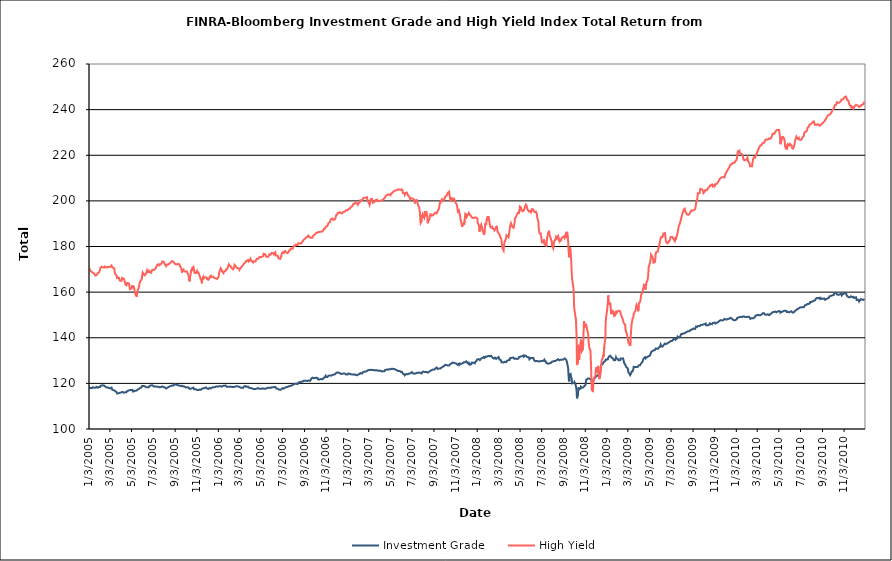
| Category | Investment Grade | High Yield |
|---|---|---|
| 1/3/05 | 118.355 | 170.574 |
| 1/4/05 | 118.169 | 170.517 |
| 1/5/05 | 117.956 | 169.694 |
| 1/6/05 | 117.989 | 169.699 |
| 1/7/05 | 117.939 | 169.542 |
| 1/10/05 | 117.87 | 168.823 |
| 1/11/05 | 117.994 | 168.603 |
| 1/12/05 | 118.07 | 168.683 |
| 1/13/05 | 118.318 | 168.609 |
| 1/14/05 | 118.212 | 168.194 |
| 1/18/05 | 118.078 | 168.042 |
| 1/19/05 | 118.176 | 168.174 |
| 1/20/05 | 118.084 | 167.284 |
| 1/21/05 | 118.194 | 167.368 |
| 1/24/05 | 118.473 | 167.478 |
| 1/25/05 | 118.13 | 167.697 |
| 1/26/05 | 118.18 | 167.906 |
| 1/27/05 | 118.08 | 168.274 |
| 1/28/05 | 118.339 | 168.482 |
| 1/31/05 | 118.456 | 168.678 |
| 2/1/05 | 118.49 | 169.105 |
| 2/2/05 | 118.486 | 169.572 |
| 2/3/05 | 118.433 | 169.887 |
| 2/4/05 | 118.911 | 170.571 |
| 2/7/05 | 119.08 | 171.144 |
| 2/8/05 | 119.178 | 171.413 |
| 2/9/05 | 119.306 | 171.25 |
| 2/10/05 | 119.155 | 170.924 |
| 2/11/05 | 118.971 | 170.593 |
| 2/14/05 | 119.042 | 170.773 |
| 2/15/05 | 118.98 | 171.171 |
| 2/16/05 | 118.766 | 171.224 |
| 2/17/05 | 118.661 | 171.303 |
| 2/18/05 | 118.352 | 171.032 |
| 2/22/05 | 118.139 | 170.748 |
| 2/23/05 | 118.254 | 170.912 |
| 2/24/05 | 118.225 | 171.081 |
| 2/25/05 | 118.18 | 171.134 |
| 2/28/05 | 117.922 | 170.988 |
| 3/1/05 | 117.796 | 170.877 |
| 3/2/05 | 117.736 | 170.785 |
| 3/3/05 | 117.802 | 171.032 |
| 3/4/05 | 117.918 | 171.289 |
| 3/7/05 | 118.124 | 171.696 |
| 3/8/05 | 117.817 | 171.944 |
| 3/9/05 | 117.285 | 171.287 |
| 3/10/05 | 117.163 | 170.761 |
| 3/11/05 | 117.065 | 170.715 |
| 3/14/05 | 116.92 | 170.526 |
| 3/15/05 | 116.95 | 170.082 |
| 3/16/05 | 116.622 | 168.726 |
| 3/17/05 | 116.667 | 168.15 |
| 3/18/05 | 116.519 | 168.382 |
| 3/21/05 | 116.211 | 167.214 |
| 3/22/05 | 116.044 | 166.725 |
| 3/23/05 | 115.529 | 165.829 |
| 3/24/05 | 115.888 | 166.493 |
| 3/28/05 | 115.718 | 166.298 |
| 3/29/05 | 115.692 | 165.868 |
| 3/30/05 | 115.75 | 165.095 |
| 3/31/05 | 115.919 | 165.008 |
| 4/1/05 | 116.011 | 165.062 |
| 4/4/05 | 116.057 | 164.966 |
| 4/5/05 | 116.091 | 165.623 |
| 4/6/05 | 116.258 | 166.252 |
| 4/7/05 | 116.289 | 166.516 |
| 4/8/05 | 116.026 | 166.31 |
| 4/11/05 | 115.879 | 165.799 |
| 4/12/05 | 116.017 | 165.62 |
| 4/13/05 | 116.21 | 165.447 |
| 4/14/05 | 116.07 | 164.271 |
| 4/15/05 | 115.942 | 163.43 |
| 4/18/05 | 116.11 | 163.014 |
| 4/19/05 | 116.407 | 163.615 |
| 4/20/05 | 116.606 | 164.067 |
| 4/21/05 | 116.75 | 164.422 |
| 4/22/05 | 116.888 | 164.239 |
| 4/25/05 | 116.912 | 163.83 |
| 4/26/05 | 116.795 | 163.217 |
| 4/27/05 | 116.928 | 162.147 |
| 4/28/05 | 117.106 | 161.274 |
| 4/29/05 | 117.107 | 161.118 |
| 5/2/05 | 117.066 | 161.625 |
| 5/3/05 | 117.088 | 161.922 |
| 5/4/05 | 117.197 | 162.426 |
| 5/5/05 | 117.166 | 163.052 |
| 5/6/05 | 116.464 | 162.072 |
| 5/9/05 | 116.491 | 162.251 |
| 5/10/05 | 116.669 | 161.573 |
| 5/11/05 | 116.738 | 160.583 |
| 5/12/05 | 116.734 | 160.013 |
| 5/13/05 | 116.762 | 159.112 |
| 5/16/05 | 116.825 | 158.382 |
| 5/17/05 | 116.81 | 157.926 |
| 5/18/05 | 117.103 | 159.04 |
| 5/19/05 | 117.2 | 160.332 |
| 5/20/05 | 117.224 | 160.908 |
| 5/23/05 | 117.555 | 161.967 |
| 5/24/05 | 117.615 | 162.394 |
| 5/25/05 | 117.772 | 163.685 |
| 5/26/05 | 117.869 | 164.476 |
| 5/27/05 | 118.04 | 164.878 |
| 5/31/05 | 118.344 | 165.605 |
| 6/1/05 | 118.835 | 166.301 |
| 6/2/05 | 119.15 | 167.915 |
| 6/3/05 | 119.094 | 168.585 |
| 6/6/05 | 118.834 | 167.647 |
| 6/7/05 | 119.123 | 167.992 |
| 6/8/05 | 119.007 | 167.752 |
| 6/9/05 | 118.713 | 167.355 |
| 6/10/05 | 118.558 | 167.947 |
| 6/13/05 | 118.338 | 168.225 |
| 6/14/05 | 118.273 | 168.859 |
| 6/15/05 | 118.235 | 169.375 |
| 6/16/05 | 118.28 | 168.817 |
| 6/17/05 | 118.412 | 168.92 |
| 6/20/05 | 118.306 | 168.848 |
| 6/21/05 | 118.516 | 169.328 |
| 6/22/05 | 118.862 | 169.462 |
| 6/23/05 | 118.841 | 169.072 |
| 6/24/05 | 118.934 | 168.656 |
| 6/27/05 | 119.114 | 168.487 |
| 6/28/05 | 119.023 | 169.253 |
| 6/29/05 | 119.042 | 169.587 |
| 6/30/05 | 119.17 | 169.776 |
| 7/1/05 | 119.039 | 170.002 |
| 7/5/05 | 118.573 | 169.742 |
| 7/6/05 | 118.624 | 169.738 |
| 7/7/05 | 118.828 | 169.472 |
| 7/8/05 | 118.694 | 170.096 |
| 7/11/05 | 118.594 | 170.881 |
| 7/12/05 | 118.604 | 171.246 |
| 7/13/05 | 118.482 | 171.254 |
| 7/14/05 | 118.537 | 171.994 |
| 7/15/05 | 118.496 | 172.133 |
| 7/18/05 | 118.501 | 172.272 |
| 7/19/05 | 118.445 | 172.06 |
| 7/20/05 | 118.434 | 171.737 |
| 7/21/05 | 118.256 | 171.973 |
| 7/22/05 | 118.391 | 172.158 |
| 7/25/05 | 118.451 | 172.378 |
| 7/26/05 | 118.429 | 172.562 |
| 7/27/05 | 118.432 | 172.871 |
| 7/28/05 | 118.668 | 173.405 |
| 7/29/05 | 118.553 | 173.531 |
| 8/1/05 | 118.288 | 173.341 |
| 8/2/05 | 118.273 | 173.258 |
| 8/3/05 | 118.279 | 172.756 |
| 8/4/05 | 118.308 | 172.682 |
| 8/5/05 | 117.88 | 171.931 |
| 8/8/05 | 117.771 | 171.379 |
| 8/9/05 | 117.736 | 171.576 |
| 8/10/05 | 117.919 | 172.042 |
| 8/11/05 | 118.011 | 171.972 |
| 8/12/05 | 118.331 | 172.063 |
| 8/15/05 | 118.449 | 172.214 |
| 8/16/05 | 118.63 | 172.198 |
| 8/17/05 | 118.541 | 172.286 |
| 8/18/05 | 118.673 | 172.618 |
| 8/19/05 | 118.716 | 173.023 |
| 8/22/05 | 118.862 | 173.127 |
| 8/23/05 | 119.008 | 173.376 |
| 8/24/05 | 119.013 | 173.562 |
| 8/25/05 | 119.11 | 173.621 |
| 8/26/05 | 119.051 | 173.787 |
| 8/29/05 | 119.077 | 173.328 |
| 8/30/05 | 119.201 | 173.219 |
| 8/31/05 | 119.597 | 172.896 |
| 9/1/05 | 119.641 | 172.408 |
| 9/2/05 | 119.657 | 172.126 |
| 9/6/05 | 119.443 | 172.216 |
| 9/7/05 | 119.208 | 171.872 |
| 9/8/05 | 119.142 | 172.124 |
| 9/9/05 | 119.27 | 172.248 |
| 9/12/05 | 119.071 | 172.39 |
| 9/13/05 | 119.26 | 172.289 |
| 9/14/05 | 119.247 | 172.46 |
| 9/15/05 | 119.019 | 172.043 |
| 9/16/05 | 118.745 | 171.404 |
| 9/19/05 | 118.766 | 170.692 |
| 9/20/05 | 118.671 | 170.101 |
| 9/21/05 | 118.955 | 169.776 |
| 9/22/05 | 118.983 | 168.581 |
| 9/23/05 | 118.801 | 169.499 |
| 9/26/05 | 118.591 | 169.942 |
| 9/27/05 | 118.522 | 169.37 |
| 9/28/05 | 118.596 | 169.273 |
| 9/29/05 | 118.59 | 169.141 |
| 9/30/05 | 118.444 | 169.067 |
| 10/3/05 | 118.202 | 169.047 |
| 10/4/05 | 118.256 | 169.393 |
| 10/5/05 | 118.318 | 169.115 |
| 10/6/05 | 118.271 | 168.953 |
| 10/7/05 | 118.165 | 168.435 |
| 10/10/05 | 118.24 | 167.565 |
| 10/11/05 | 118.119 | 166.364 |
| 10/12/05 | 117.899 | 165.302 |
| 10/13/05 | 117.584 | 164.715 |
| 10/14/05 | 117.517 | 165.782 |
| 10/17/05 | 117.745 | 168.694 |
| 10/18/05 | 117.879 | 169.843 |
| 10/19/05 | 117.944 | 169.193 |
| 10/20/05 | 117.854 | 169.427 |
| 10/21/05 | 118.216 | 170.69 |
| 10/24/05 | 118.129 | 171.077 |
| 10/25/05 | 117.862 | 170.67 |
| 10/26/05 | 117.399 | 169.608 |
| 10/27/05 | 117.37 | 168.431 |
| 10/28/05 | 117.371 | 168.099 |
| 10/31/05 | 117.417 | 168.309 |
| 11/1/05 | 117.42 | 168.631 |
| 11/2/05 | 117.273 | 168.704 |
| 11/3/05 | 117.143 | 169.234 |
| 11/4/05 | 117.056 | 168.585 |
| 11/7/05 | 117.113 | 168.659 |
| 11/8/05 | 117.416 | 168.487 |
| 11/9/05 | 117.192 | 167.82 |
| 11/10/05 | 117.28 | 167.717 |
| 11/11/05 | 117.402 | 167.95 |
| 11/14/05 | 117.196 | 165.581 |
| 11/15/05 | 117.296 | 165.597 |
| 11/16/05 | 117.544 | 164.958 |
| 11/17/05 | 117.642 | 163.861 |
| 11/18/05 | 117.631 | 165.746 |
| 11/21/05 | 117.838 | 166.68 |
| 11/22/05 | 117.903 | 165.992 |
| 11/23/05 | 117.906 | 166.083 |
| 11/25/05 | 117.966 | 166.406 |
| 11/28/05 | 118.237 | 166.498 |
| 11/29/05 | 118.064 | 166.523 |
| 11/30/05 | 117.916 | 166.162 |
| 12/1/05 | 117.79 | 166.33 |
| 12/2/05 | 117.692 | 165.68 |
| 12/5/05 | 117.557 | 165.418 |
| 12/6/05 | 117.72 | 165.216 |
| 12/7/05 | 117.711 | 165.386 |
| 12/8/05 | 117.953 | 166.043 |
| 12/9/05 | 117.832 | 166.748 |
| 12/12/05 | 117.767 | 167.216 |
| 12/13/05 | 117.816 | 166.624 |
| 12/14/05 | 118.183 | 166.691 |
| 12/15/05 | 118.129 | 166.545 |
| 12/16/05 | 118.333 | 166.749 |
| 12/19/05 | 118.322 | 166.813 |
| 12/20/05 | 118.229 | 166.355 |
| 12/21/05 | 118.1 | 166.208 |
| 12/22/05 | 118.324 | 166.223 |
| 12/23/05 | 118.449 | 166.157 |
| 12/27/05 | 118.605 | 166.062 |
| 12/28/05 | 118.703 | 166.372 |
| 12/29/05 | 118.677 | 166.072 |
| 12/30/05 | 118.668 | 165.743 |
| 1/3/06 | 118.674 | 166.691 |
| 1/4/06 | 118.799 | 167.668 |
| 1/5/06 | 118.822 | 168.62 |
| 1/6/06 | 118.755 | 168.94 |
| 1/9/06 | 118.793 | 170.439 |
| 1/10/06 | 118.606 | 170.159 |
| 1/11/06 | 118.506 | 170.197 |
| 1/12/06 | 118.581 | 169.656 |
| 1/13/06 | 118.818 | 169.08 |
| 1/17/06 | 118.971 | 168.325 |
| 1/18/06 | 119.051 | 168.332 |
| 1/19/06 | 118.962 | 169.118 |
| 1/20/06 | 118.986 | 168.811 |
| 1/23/06 | 119.072 | 169.326 |
| 1/24/06 | 119.029 | 169.92 |
| 1/25/06 | 118.781 | 170.223 |
| 1/26/06 | 118.495 | 169.839 |
| 1/27/06 | 118.554 | 170.065 |
| 1/30/06 | 118.517 | 171.279 |
| 1/31/06 | 118.554 | 171.482 |
| 2/1/06 | 118.471 | 172.165 |
| 2/2/06 | 118.465 | 172.186 |
| 2/3/06 | 118.436 | 171.664 |
| 2/6/06 | 118.598 | 171.424 |
| 2/7/06 | 118.518 | 171.152 |
| 2/8/06 | 118.432 | 170.671 |
| 2/9/06 | 118.444 | 170.674 |
| 2/10/06 | 118.488 | 170.494 |
| 2/13/06 | 118.415 | 169.994 |
| 2/14/06 | 118.349 | 169.841 |
| 2/15/06 | 118.406 | 170.593 |
| 2/16/06 | 118.46 | 171.163 |
| 2/17/06 | 118.743 | 171.919 |
| 2/21/06 | 118.694 | 171.223 |
| 2/22/06 | 118.758 | 170.883 |
| 2/23/06 | 118.727 | 170.677 |
| 2/24/06 | 118.718 | 170.573 |
| 2/27/06 | 118.641 | 170.477 |
| 2/28/06 | 118.802 | 170.797 |
| 3/1/06 | 118.759 | 170.813 |
| 3/2/06 | 118.509 | 170.211 |
| 3/3/06 | 118.336 | 169.768 |
| 3/6/06 | 118.146 | 170.592 |
| 3/7/06 | 118.012 | 170.479 |
| 3/8/06 | 118.046 | 170.583 |
| 3/9/06 | 118.077 | 171.112 |
| 3/10/06 | 117.978 | 171.347 |
| 3/13/06 | 118.031 | 171.793 |
| 3/14/06 | 118.338 | 171.93 |
| 3/15/06 | 118.312 | 172.411 |
| 3/16/06 | 118.691 | 172.782 |
| 3/17/06 | 118.674 | 172.445 |
| 3/20/06 | 118.811 | 173.066 |
| 3/21/06 | 118.574 | 173.581 |
| 3/22/06 | 118.546 | 173.663 |
| 3/23/06 | 118.449 | 173.521 |
| 3/24/06 | 118.618 | 173.631 |
| 3/27/06 | 118.594 | 174.043 |
| 3/28/06 | 118.371 | 173.919 |
| 3/29/06 | 118.147 | 173.432 |
| 3/30/06 | 117.938 | 173.453 |
| 3/31/06 | 117.96 | 173.908 |
| 4/3/06 | 117.908 | 174.636 |
| 4/4/06 | 117.993 | 174.046 |
| 4/5/06 | 118.113 | 174.006 |
| 4/6/06 | 117.917 | 173.58 |
| 4/7/06 | 117.677 | 173.206 |
| 4/10/06 | 117.63 | 173.014 |
| 4/11/06 | 117.783 | 173.5 |
| 4/12/06 | 117.734 | 173.474 |
| 4/13/06 | 117.466 | 173.316 |
| 4/17/06 | 117.543 | 173.427 |
| 4/18/06 | 117.753 | 173.833 |
| 4/19/06 | 117.661 | 174.121 |
| 4/20/06 | 117.682 | 174.549 |
| 4/21/06 | 117.748 | 174.632 |
| 4/24/06 | 117.928 | 174.586 |
| 4/25/06 | 117.696 | 174.476 |
| 4/26/06 | 117.526 | 174.553 |
| 4/27/06 | 117.664 | 174.892 |
| 4/28/06 | 117.787 | 175.342 |
| 5/1/06 | 117.701 | 175.415 |
| 5/2/06 | 117.789 | 175.745 |
| 5/3/06 | 117.668 | 175.608 |
| 5/4/06 | 117.621 | 175.404 |
| 5/5/06 | 117.789 | 175.485 |
| 5/8/06 | 117.806 | 175.687 |
| 5/9/06 | 117.764 | 176.034 |
| 5/10/06 | 117.877 | 176.819 |
| 5/11/06 | 117.674 | 177.07 |
| 5/12/06 | 117.506 | 176.788 |
| 5/15/06 | 117.619 | 176.518 |
| 5/16/06 | 117.762 | 176.351 |
| 5/17/06 | 117.516 | 175.603 |
| 5/18/06 | 117.796 | 175.484 |
| 5/19/06 | 117.992 | 175.82 |
| 5/22/06 | 118.086 | 175.36 |
| 5/23/06 | 117.958 | 175.7 |
| 5/24/06 | 118.092 | 175.402 |
| 5/25/06 | 118.056 | 176.092 |
| 5/26/06 | 118.137 | 176.571 |
| 5/30/06 | 118.007 | 176.45 |
| 5/31/06 | 117.85 | 176.622 |
| 6/1/06 | 117.808 | 176.772 |
| 6/2/06 | 118.329 | 177.197 |
| 6/5/06 | 118.348 | 177.163 |
| 6/6/06 | 118.265 | 176.823 |
| 6/7/06 | 118.243 | 177.095 |
| 6/8/06 | 118.345 | 176.549 |
| 6/9/06 | 118.409 | 177.007 |
| 6/12/06 | 118.417 | 177.452 |
| 6/13/06 | 118.446 | 176.746 |
| 6/14/06 | 118.085 | 176.055 |
| 6/15/06 | 117.763 | 175.778 |
| 6/16/06 | 117.774 | 175.773 |
| 6/19/06 | 117.633 | 175.923 |
| 6/20/06 | 117.562 | 175.546 |
| 6/21/06 | 117.526 | 174.856 |
| 6/22/06 | 117.346 | 174.838 |
| 6/23/06 | 117.195 | 174.518 |
| 6/26/06 | 117.176 | 174.595 |
| 6/27/06 | 117.294 | 174.784 |
| 6/28/06 | 117.237 | 174.827 |
| 6/29/06 | 117.383 | 175.673 |
| 6/30/06 | 117.754 | 176.833 |
| 7/3/06 | 117.916 | 177.456 |
| 7/5/06 | 117.59 | 177.217 |
| 7/6/06 | 117.731 | 177.166 |
| 7/7/06 | 117.985 | 177.736 |
| 7/10/06 | 118.128 | 178.015 |
| 7/11/06 | 118.274 | 178.054 |
| 7/12/06 | 118.213 | 178.072 |
| 7/13/06 | 118.342 | 177.398 |
| 7/14/06 | 118.452 | 177.109 |
| 7/17/06 | 118.482 | 177.111 |
| 7/18/06 | 118.267 | 177.21 |
| 7/19/06 | 118.51 | 177.544 |
| 7/20/06 | 118.734 | 177.763 |
| 7/21/06 | 118.868 | 178.222 |
| 7/24/06 | 118.841 | 178.445 |
| 7/25/06 | 118.732 | 178.653 |
| 7/26/06 | 118.842 | 179.161 |
| 7/27/06 | 118.975 | 179.186 |
| 7/28/06 | 119.262 | 178.942 |
| 7/31/06 | 119.36 | 179.06 |
| 8/1/06 | 119.366 | 179.167 |
| 8/2/06 | 119.499 | 179.868 |
| 8/3/06 | 119.528 | 179.706 |
| 8/4/06 | 119.838 | 180.377 |
| 8/7/06 | 119.863 | 180.309 |
| 8/8/06 | 119.854 | 180.681 |
| 8/9/06 | 119.813 | 180.854 |
| 8/10/06 | 119.815 | 180.426 |
| 8/11/06 | 119.746 | 180.502 |
| 8/14/06 | 119.68 | 180.66 |
| 8/15/06 | 119.962 | 180.974 |
| 8/16/06 | 120.29 | 181.443 |
| 8/17/06 | 120.387 | 181.84 |
| 8/18/06 | 120.45 | 181.696 |
| 8/21/06 | 120.615 | 181.355 |
| 8/22/06 | 120.65 | 181.196 |
| 8/23/06 | 120.606 | 181.291 |
| 8/24/06 | 120.691 | 181.334 |
| 8/25/06 | 120.808 | 181.765 |
| 8/28/06 | 120.799 | 182.194 |
| 8/29/06 | 120.708 | 182.207 |
| 8/30/06 | 120.958 | 182.587 |
| 8/31/06 | 121.133 | 182.958 |
| 9/1/06 | 121.171 | 183.098 |
| 9/5/06 | 121.097 | 183.569 |
| 9/6/06 | 120.89 | 183.792 |
| 9/7/06 | 120.968 | 184.008 |
| 9/8/06 | 121.166 | 184.358 |
| 9/11/06 | 121.045 | 184.279 |
| 9/12/06 | 121.109 | 184.614 |
| 9/13/06 | 121.352 | 184.795 |
| 9/14/06 | 121.258 | 184.807 |
| 9/15/06 | 121.212 | 184.377 |
| 9/18/06 | 121.094 | 183.9 |
| 9/19/06 | 121.401 | 184.023 |
| 9/20/06 | 121.575 | 184.118 |
| 9/21/06 | 121.842 | 183.804 |
| 9/22/06 | 122.161 | 183.886 |
| 9/25/06 | 122.502 | 183.889 |
| 9/26/06 | 122.44 | 184.488 |
| 9/27/06 | 122.404 | 184.846 |
| 9/28/06 | 122.249 | 184.791 |
| 9/29/06 | 122.229 | 185.039 |
| 10/2/06 | 122.369 | 185.25 |
| 10/3/06 | 122.367 | 185.078 |
| 10/4/06 | 122.584 | 185.762 |
| 10/5/06 | 122.469 | 185.899 |
| 10/6/06 | 122.197 | 185.944 |
| 10/9/06 | 122.396 | 186.149 |
| 10/10/06 | 121.855 | 185.966 |
| 10/11/06 | 121.793 | 186.212 |
| 10/12/06 | 121.773 | 186.368 |
| 10/13/06 | 121.637 | 186.386 |
| 10/16/06 | 121.782 | 186.334 |
| 10/17/06 | 122.002 | 186.37 |
| 10/18/06 | 121.984 | 186.464 |
| 10/19/06 | 121.942 | 186.54 |
| 10/20/06 | 121.896 | 186.494 |
| 10/23/06 | 121.774 | 186.528 |
| 10/24/06 | 121.789 | 186.861 |
| 10/25/06 | 121.967 | 186.851 |
| 10/26/06 | 122.315 | 187.245 |
| 10/27/06 | 122.633 | 187.706 |
| 10/30/06 | 122.777 | 187.836 |
| 10/31/06 | 123.032 | 188.056 |
| 11/1/06 | 123.353 | 188.569 |
| 11/2/06 | 123.314 | 188.898 |
| 11/3/06 | 122.811 | 188.838 |
| 11/6/06 | 122.778 | 188.977 |
| 11/7/06 | 123.198 | 189.575 |
| 11/8/06 | 123.214 | 189.569 |
| 11/9/06 | 123.348 | 189.995 |
| 11/10/06 | 123.576 | 190.438 |
| 11/13/06 | 123.474 | 190.655 |
| 11/14/06 | 123.665 | 191.193 |
| 11/15/06 | 123.498 | 191.861 |
| 11/16/06 | 123.354 | 192.242 |
| 11/17/06 | 123.534 | 192.207 |
| 11/20/06 | 123.64 | 192.272 |
| 11/21/06 | 123.722 | 191.865 |
| 11/22/06 | 123.884 | 191.714 |
| 11/24/06 | 123.904 | 191.768 |
| 11/27/06 | 123.957 | 191.862 |
| 11/28/06 | 124.2 | 191.783 |
| 11/29/06 | 124.257 | 192.597 |
| 11/30/06 | 124.441 | 193.283 |
| 12/1/06 | 124.715 | 193.763 |
| 12/4/06 | 124.833 | 194.03 |
| 12/5/06 | 124.897 | 194.679 |
| 12/6/06 | 124.77 | 194.919 |
| 12/7/06 | 124.698 | 194.992 |
| 12/8/06 | 124.488 | 194.795 |
| 12/11/06 | 124.494 | 195.075 |
| 12/12/06 | 124.596 | 195.019 |
| 12/13/06 | 124.306 | 194.599 |
| 12/14/06 | 124.12 | 194.349 |
| 12/15/06 | 124.292 | 194.722 |
| 12/18/06 | 124.222 | 194.604 |
| 12/19/06 | 124.264 | 194.871 |
| 12/20/06 | 124.252 | 195.083 |
| 12/21/06 | 124.356 | 195.365 |
| 12/22/06 | 124.285 | 195.436 |
| 12/26/06 | 124.265 | 195.372 |
| 12/27/06 | 124.107 | 195.773 |
| 12/28/06 | 123.924 | 195.839 |
| 12/29/06 | 123.839 | 195.777 |
| 1/2/07 | 123.878 | 195.905 |
| 1/3/07 | 124.051 | 196.28 |
| 1/4/07 | 124.344 | 196.334 |
| 1/5/07 | 124.185 | 196.402 |
| 1/8/07 | 124.207 | 196.531 |
| 1/9/07 | 124.252 | 196.799 |
| 1/10/07 | 124.14 | 197.148 |
| 1/11/07 | 123.99 | 197.227 |
| 1/12/07 | 123.738 | 197.405 |
| 1/16/07 | 123.896 | 197.796 |
| 1/17/07 | 123.879 | 198.492 |
| 1/18/07 | 123.839 | 198.36 |
| 1/19/07 | 123.83 | 198.242 |
| 1/22/07 | 123.983 | 198.886 |
| 1/23/07 | 123.913 | 199.156 |
| 1/24/07 | 123.87 | 199.35 |
| 1/25/07 | 123.668 | 199.17 |
| 1/26/07 | 123.534 | 198.828 |
| 1/29/07 | 123.569 | 198.91 |
| 1/30/07 | 123.571 | 198.5 |
| 1/31/07 | 123.699 | 198.364 |
| 2/1/07 | 123.895 | 198.88 |
| 2/2/07 | 123.971 | 199.069 |
| 2/5/07 | 124.108 | 199.258 |
| 2/6/07 | 124.273 | 199.594 |
| 2/7/07 | 124.554 | 200.241 |
| 2/8/07 | 124.562 | 200.072 |
| 2/9/07 | 124.397 | 200.453 |
| 2/12/07 | 124.312 | 200.256 |
| 2/13/07 | 124.237 | 200.222 |
| 2/14/07 | 124.616 | 200.634 |
| 2/15/07 | 124.994 | 201.198 |
| 2/16/07 | 125.102 | 201.277 |
| 2/20/07 | 125.153 | 201.407 |
| 2/21/07 | 125.138 | 201.661 |
| 2/22/07 | 124.999 | 201.758 |
| 2/23/07 | 125.194 | 201.374 |
| 2/26/07 | 125.46 | 201.572 |
| 2/27/07 | 125.707 | 200.32 |
| 2/28/07 | 125.713 | 200.403 |
| 3/1/07 | 125.833 | 199.891 |
| 3/2/07 | 125.88 | 199.424 |
| 3/5/07 | 125.831 | 198.211 |
| 3/6/07 | 125.77 | 198.621 |
| 3/7/07 | 125.901 | 199.783 |
| 3/8/07 | 126.003 | 200.73 |
| 3/9/07 | 125.682 | 200.832 |
| 3/12/07 | 125.839 | 200.797 |
| 3/13/07 | 125.995 | 200.115 |
| 3/14/07 | 125.876 | 199.18 |
| 3/15/07 | 125.856 | 199.611 |
| 3/16/07 | 125.799 | 199.487 |
| 3/19/07 | 125.681 | 199.607 |
| 3/20/07 | 125.75 | 199.589 |
| 3/21/07 | 125.786 | 199.958 |
| 3/22/07 | 125.785 | 200.399 |
| 3/23/07 | 125.694 | 200.585 |
| 3/26/07 | 125.793 | 200.544 |
| 3/27/07 | 125.675 | 200.342 |
| 3/28/07 | 125.706 | 199.918 |
| 3/29/07 | 125.555 | 200.037 |
| 3/30/07 | 125.463 | 200.034 |
| 4/2/07 | 125.54 | 199.916 |
| 4/3/07 | 125.477 | 200.015 |
| 4/4/07 | 125.538 | 199.761 |
| 4/5/07 | 125.556 | 200.04 |
| 4/9/07 | 125.202 | 200.256 |
| 4/10/07 | 125.347 | 200.333 |
| 4/11/07 | 125.426 | 200.629 |
| 4/12/07 | 125.362 | 200.663 |
| 4/13/07 | 125.227 | 200.764 |
| 4/16/07 | 125.348 | 201.113 |
| 4/17/07 | 125.654 | 201.426 |
| 4/18/07 | 125.91 | 201.662 |
| 4/19/07 | 125.944 | 201.898 |
| 4/20/07 | 125.933 | 202.293 |
| 4/23/07 | 126.097 | 202.541 |
| 4/24/07 | 126.266 | 202.624 |
| 4/25/07 | 126.164 | 202.613 |
| 4/26/07 | 125.989 | 202.86 |
| 4/27/07 | 125.891 | 202.738 |
| 4/30/07 | 126.253 | 202.652 |
| 5/1/07 | 126.238 | 202.562 |
| 5/2/07 | 126.267 | 202.818 |
| 5/3/07 | 126.158 | 202.462 |
| 5/4/07 | 126.355 | 203.179 |
| 5/7/07 | 126.433 | 203.277 |
| 5/8/07 | 126.485 | 203.463 |
| 5/9/07 | 126.379 | 203.592 |
| 5/10/07 | 126.346 | 203.891 |
| 5/11/07 | 126.383 | 203.92 |
| 5/14/07 | 126.274 | 204.361 |
| 5/15/07 | 126.252 | 204.545 |
| 5/16/07 | 126.221 | 204.447 |
| 5/17/07 | 126.045 | 204.53 |
| 5/18/07 | 125.881 | 204.602 |
| 5/21/07 | 125.782 | 204.747 |
| 5/22/07 | 125.717 | 204.814 |
| 5/23/07 | 125.505 | 205.115 |
| 5/24/07 | 125.439 | 205.087 |
| 5/25/07 | 125.549 | 205.098 |
| 5/29/07 | 125.417 | 204.914 |
| 5/30/07 | 125.382 | 204.678 |
| 5/31/07 | 125.226 | 204.745 |
| 6/1/07 | 125.032 | 204.824 |
| 6/4/07 | 125.097 | 205.04 |
| 6/5/07 | 124.902 | 204.776 |
| 6/6/07 | 124.842 | 204.532 |
| 6/7/07 | 124.223 | 203.453 |
| 6/8/07 | 123.906 | 203.067 |
| 6/11/07 | 123.99 | 203.383 |
| 6/12/07 | 123.53 | 202.648 |
| 6/13/07 | 123.544 | 202.571 |
| 6/14/07 | 123.669 | 202.937 |
| 6/15/07 | 123.895 | 203.467 |
| 6/18/07 | 124.105 | 203.671 |
| 6/19/07 | 124.36 | 203.504 |
| 6/20/07 | 124.238 | 203.064 |
| 6/21/07 | 124.007 | 202.443 |
| 6/22/07 | 123.98 | 202.47 |
| 6/25/07 | 124.345 | 201.96 |
| 6/26/07 | 124.347 | 201.716 |
| 6/27/07 | 124.467 | 200.844 |
| 6/28/07 | 124.393 | 201.294 |
| 6/29/07 | 124.637 | 201.274 |
| 7/2/07 | 124.935 | 201.085 |
| 7/3/07 | 125.017 | 201.275 |
| 7/5/07 | 124.445 | 200.95 |
| 7/6/07 | 124.162 | 200.725 |
| 7/9/07 | 124.238 | 200.506 |
| 7/10/07 | 124.645 | 199.718 |
| 7/11/07 | 124.564 | 198.863 |
| 7/12/07 | 124.286 | 199.626 |
| 7/13/07 | 124.36 | 200.187 |
| 7/16/07 | 124.628 | 200.38 |
| 7/17/07 | 124.609 | 200.224 |
| 7/18/07 | 124.686 | 199.382 |
| 7/19/07 | 124.59 | 199.34 |
| 7/20/07 | 124.884 | 198.091 |
| 7/23/07 | 124.784 | 197.088 |
| 7/24/07 | 124.755 | 195.589 |
| 7/25/07 | 124.767 | 194.886 |
| 7/26/07 | 124.517 | 192.08 |
| 7/27/07 | 124.452 | 190.261 |
| 7/30/07 | 124.385 | 191.19 |
| 7/31/07 | 124.837 | 193.791 |
| 8/1/07 | 124.902 | 192.503 |
| 8/2/07 | 125.002 | 194.003 |
| 8/3/07 | 125.193 | 193.574 |
| 8/6/07 | 125.036 | 192.652 |
| 8/7/07 | 125.064 | 193.511 |
| 8/8/07 | 124.811 | 195.532 |
| 8/9/07 | 124.942 | 195.156 |
| 8/10/07 | 124.774 | 193.951 |
| 8/13/07 | 124.953 | 194.81 |
| 8/14/07 | 125.03 | 194.169 |
| 8/15/07 | 124.847 | 192.835 |
| 8/16/07 | 124.707 | 190.197 |
| 8/17/07 | 124.855 | 191.335 |
| 8/20/07 | 125.13 | 191.567 |
| 8/21/07 | 125.337 | 191.711 |
| 8/22/07 | 125.247 | 193.124 |
| 8/23/07 | 125.454 | 194.082 |
| 8/24/07 | 125.548 | 194.1 |
| 8/27/07 | 125.832 | 194.037 |
| 8/28/07 | 125.956 | 193.53 |
| 8/29/07 | 125.915 | 193.489 |
| 8/30/07 | 126.024 | 193.173 |
| 8/31/07 | 126.124 | 193.701 |
| 9/4/07 | 126.062 | 194.305 |
| 9/5/07 | 126.322 | 194.567 |
| 9/6/07 | 126.209 | 194.803 |
| 9/7/07 | 126.579 | 194.472 |
| 9/10/07 | 126.956 | 194.489 |
| 9/11/07 | 126.808 | 194.343 |
| 9/12/07 | 126.603 | 194.649 |
| 9/13/07 | 126.308 | 195.468 |
| 9/14/07 | 126.431 | 195.821 |
| 9/17/07 | 126.544 | 196.738 |
| 9/18/07 | 126.647 | 197.91 |
| 9/19/07 | 126.859 | 199.215 |
| 9/20/07 | 126.477 | 198.754 |
| 9/21/07 | 126.68 | 199.717 |
| 9/24/07 | 126.92 | 200.436 |
| 9/25/07 | 127.027 | 199.49 |
| 9/26/07 | 126.927 | 200.57 |
| 9/27/07 | 127.255 | 200.7 |
| 9/28/07 | 127.429 | 200.427 |
| 10/1/07 | 127.571 | 200.511 |
| 10/2/07 | 127.822 | 200.91 |
| 10/3/07 | 127.85 | 201.149 |
| 10/4/07 | 128.121 | 201.803 |
| 10/5/07 | 127.908 | 202.13 |
| 10/8/07 | 128.074 | 202.277 |
| 10/9/07 | 127.855 | 202.481 |
| 10/10/07 | 127.87 | 202.858 |
| 10/11/07 | 127.816 | 203.431 |
| 10/12/07 | 127.803 | 203.619 |
| 10/15/07 | 127.787 | 204.018 |
| 10/16/07 | 127.92 | 202.961 |
| 10/17/07 | 128.145 | 202.194 |
| 10/18/07 | 128.388 | 201.184 |
| 10/19/07 | 128.764 | 200.22 |
| 10/22/07 | 128.744 | 199.94 |
| 10/23/07 | 128.8 | 201.095 |
| 10/24/07 | 129.125 | 200.685 |
| 10/25/07 | 129.096 | 201.015 |
| 10/26/07 | 129.002 | 200.81 |
| 10/29/07 | 129.084 | 201.045 |
| 10/30/07 | 129.091 | 200.792 |
| 10/31/07 | 128.802 | 201.044 |
| 11/1/07 | 128.846 | 200.027 |
| 11/2/07 | 128.883 | 199.368 |
| 11/5/07 | 128.673 | 198.673 |
| 11/6/07 | 128.465 | 199.07 |
| 11/7/07 | 128.277 | 197.762 |
| 11/8/07 | 128.152 | 196.426 |
| 11/9/07 | 128.304 | 195.356 |
| 11/12/07 | 128.625 | 195.851 |
| 11/13/07 | 128.116 | 194.919 |
| 11/14/07 | 128.216 | 195.309 |
| 11/15/07 | 128.465 | 193.922 |
| 11/16/07 | 128.571 | 192.307 |
| 11/19/07 | 128.62 | 190.44 |
| 11/20/07 | 128.602 | 189.686 |
| 11/21/07 | 128.816 | 188.575 |
| 11/23/07 | 128.849 | 189.885 |
| 11/26/07 | 129.28 | 190.05 |
| 11/27/07 | 129.144 | 189.602 |
| 11/28/07 | 128.915 | 191.36 |
| 11/29/07 | 129.204 | 192.521 |
| 11/30/07 | 129.348 | 194.322 |
| 12/3/07 | 129.647 | 193.986 |
| 12/4/07 | 129.522 | 193.044 |
| 12/5/07 | 129.283 | 193.406 |
| 12/6/07 | 128.95 | 193.178 |
| 12/7/07 | 128.559 | 193.924 |
| 12/10/07 | 128.419 | 194.773 |
| 12/11/07 | 128.9 | 194.97 |
| 12/12/07 | 128.732 | 194.822 |
| 12/13/07 | 128.462 | 193.933 |
| 12/14/07 | 128.229 | 193.697 |
| 12/17/07 | 128.407 | 193.173 |
| 12/18/07 | 128.814 | 193.232 |
| 12/19/07 | 129.164 | 192.678 |
| 12/20/07 | 129.531 | 192.81 |
| 12/21/07 | 129.083 | 192.766 |
| 12/24/07 | 128.999 | 192.429 |
| 12/26/07 | 128.567 | 192.412 |
| 12/27/07 | 128.805 | 192.783 |
| 12/28/07 | 129.396 | 192.557 |
| 12/31/07 | 129.715 | 192.662 |
| 1/2/08 | 130.418 | 193.015 |
| 1/3/08 | 130.465 | 192.354 |
| 1/4/08 | 130.701 | 190.45 |
| 1/7/08 | 130.646 | 189.339 |
| 1/8/08 | 130.495 | 188.521 |
| 1/9/08 | 130.343 | 186.529 |
| 1/10/08 | 130.212 | 187.67 |
| 1/11/08 | 130.647 | 188.403 |
| 1/14/08 | 130.89 | 189.554 |
| 1/15/08 | 131.142 | 189.194 |
| 1/16/08 | 131.163 | 188.305 |
| 1/17/08 | 131.255 | 187.15 |
| 1/18/08 | 131.12 | 187.499 |
| 1/22/08 | 131.32 | 185.152 |
| 1/23/08 | 132 | 185.136 |
| 1/24/08 | 131.277 | 187.688 |
| 1/25/08 | 131.498 | 189.908 |
| 1/28/08 | 131.701 | 189.789 |
| 1/29/08 | 131.528 | 191.43 |
| 1/30/08 | 131.443 | 191.885 |
| 1/31/08 | 131.806 | 191.42 |
| 2/1/08 | 132.175 | 192.89 |
| 2/4/08 | 132.042 | 192.888 |
| 2/5/08 | 132.397 | 191.845 |
| 2/6/08 | 132.315 | 190.898 |
| 2/7/08 | 131.913 | 189.807 |
| 2/8/08 | 131.858 | 188.754 |
| 2/11/08 | 132.071 | 188.227 |
| 2/12/08 | 131.812 | 187.828 |
| 2/13/08 | 131.723 | 188.287 |
| 2/14/08 | 131.411 | 188.623 |
| 2/15/08 | 131.396 | 187.92 |
| 2/19/08 | 130.87 | 187.561 |
| 2/20/08 | 130.454 | 187.092 |
| 2/21/08 | 131.024 | 187.509 |
| 2/22/08 | 131.25 | 187.509 |
| 2/25/08 | 130.748 | 188.157 |
| 2/26/08 | 130.641 | 189.064 |
| 2/27/08 | 130.841 | 189.012 |
| 2/28/08 | 131.102 | 187.823 |
| 2/29/08 | 131.385 | 186.502 |
| 3/3/08 | 131.529 | 185.839 |
| 3/4/08 | 131.097 | 185.571 |
| 3/5/08 | 130.549 | 185.945 |
| 3/6/08 | 130.196 | 185.1 |
| 3/7/08 | 130.179 | 184.33 |
| 3/10/08 | 130.089 | 183.508 |
| 3/11/08 | 129.281 | 182.648 |
| 3/12/08 | 129.617 | 181.59 |
| 3/13/08 | 129.458 | 179.56 |
| 3/14/08 | 129.254 | 179.609 |
| 3/17/08 | 129.146 | 178.267 |
| 3/18/08 | 129.118 | 180.046 |
| 3/19/08 | 129.324 | 181.637 |
| 3/20/08 | 129.465 | 181.502 |
| 3/24/08 | 129.283 | 183.494 |
| 3/25/08 | 129.677 | 184.947 |
| 3/26/08 | 129.818 | 185.262 |
| 3/27/08 | 129.716 | 185.207 |
| 3/28/08 | 129.868 | 184.686 |
| 3/31/08 | 130.198 | 184.075 |
| 4/1/08 | 129.939 | 184.911 |
| 4/2/08 | 129.89 | 186.25 |
| 4/3/08 | 130.207 | 187.289 |
| 4/4/08 | 131.032 | 188.863 |
| 4/7/08 | 131.091 | 190.174 |
| 4/8/08 | 131.124 | 189.873 |
| 4/9/08 | 131.335 | 189.218 |
| 4/10/08 | 131.272 | 188.87 |
| 4/11/08 | 131.4 | 188.573 |
| 4/14/08 | 131.303 | 188.165 |
| 4/15/08 | 131.011 | 188.377 |
| 4/16/08 | 130.775 | 189.62 |
| 4/17/08 | 130.473 | 190.245 |
| 4/18/08 | 130.403 | 192.283 |
| 4/21/08 | 130.875 | 192.872 |
| 4/22/08 | 131.081 | 193.258 |
| 4/23/08 | 131.083 | 193.738 |
| 4/24/08 | 130.695 | 193.801 |
| 4/25/08 | 130.669 | 194.074 |
| 4/28/08 | 130.918 | 195.04 |
| 4/29/08 | 131.3 | 194.393 |
| 4/30/08 | 131.579 | 195.026 |
| 5/1/08 | 131.995 | 195.693 |
| 5/2/08 | 131.798 | 197.506 |
| 5/5/08 | 131.789 | 197.134 |
| 5/6/08 | 131.685 | 196.313 |
| 5/7/08 | 131.61 | 196.127 |
| 5/8/08 | 131.938 | 196.003 |
| 5/9/08 | 132.227 | 195.477 |
| 5/12/08 | 132.213 | 195.588 |
| 5/13/08 | 131.711 | 195.662 |
| 5/14/08 | 131.485 | 195.803 |
| 5/15/08 | 131.705 | 196.55 |
| 5/16/08 | 132.199 | 197.308 |
| 5/19/08 | 132.108 | 198.386 |
| 5/20/08 | 132.256 | 198.175 |
| 5/21/08 | 132.164 | 197.922 |
| 5/22/08 | 131.536 | 197.043 |
| 5/23/08 | 131.779 | 196.421 |
| 5/27/08 | 131.441 | 195.348 |
| 5/28/08 | 131.007 | 195.417 |
| 5/29/08 | 130.529 | 195.606 |
| 5/30/08 | 130.915 | 195.564 |
| 6/2/08 | 131.166 | 194.964 |
| 6/3/08 | 131.25 | 194.69 |
| 6/4/08 | 131.461 | 194.722 |
| 6/5/08 | 131.112 | 196.418 |
| 6/6/08 | 131.458 | 196.319 |
| 6/9/08 | 131.163 | 196.19 |
| 6/10/08 | 130.533 | 195.415 |
| 6/11/08 | 130.453 | 195.214 |
| 6/12/08 | 129.965 | 195.135 |
| 6/13/08 | 129.866 | 195.07 |
| 6/16/08 | 129.73 | 195.312 |
| 6/17/08 | 129.897 | 195.486 |
| 6/18/08 | 130.099 | 194.944 |
| 6/19/08 | 129.804 | 194.209 |
| 6/20/08 | 129.881 | 192.602 |
| 6/23/08 | 129.699 | 190.908 |
| 6/24/08 | 129.667 | 188.256 |
| 6/25/08 | 129.569 | 188.171 |
| 6/26/08 | 129.559 | 186.091 |
| 6/27/08 | 129.793 | 185.641 |
| 6/30/08 | 129.795 | 185.68 |
| 7/1/08 | 129.703 | 184.21 |
| 7/2/08 | 129.788 | 183.513 |
| 7/3/08 | 129.777 | 181.896 |
| 7/7/08 | 129.885 | 181.98 |
| 7/8/08 | 130.009 | 181.365 |
| 7/9/08 | 130.199 | 183.04 |
| 7/10/08 | 130.358 | 182.4 |
| 7/11/08 | 129.738 | 180.988 |
| 7/14/08 | 129.656 | 181.206 |
| 7/15/08 | 129.441 | 180.01 |
| 7/16/08 | 128.888 | 180.715 |
| 7/17/08 | 128.81 | 182.637 |
| 7/18/08 | 128.606 | 184.058 |
| 7/21/08 | 128.599 | 185.736 |
| 7/22/08 | 128.477 | 185.217 |
| 7/23/08 | 128.425 | 186.853 |
| 7/24/08 | 128.815 | 185.848 |
| 7/25/08 | 128.752 | 184.869 |
| 7/28/08 | 128.897 | 183.6 |
| 7/29/08 | 128.726 | 182.974 |
| 7/30/08 | 128.842 | 183.131 |
| 7/31/08 | 129.428 | 182.114 |
| 8/1/08 | 129.565 | 180.159 |
| 8/4/08 | 129.645 | 179.204 |
| 8/5/08 | 129.59 | 180.161 |
| 8/6/08 | 129.439 | 181.642 |
| 8/7/08 | 129.833 | 182.178 |
| 8/8/08 | 130.02 | 181.827 |
| 8/11/08 | 129.864 | 183.523 |
| 8/12/08 | 130.119 | 184.198 |
| 8/13/08 | 130.041 | 183.872 |
| 8/14/08 | 130.246 | 183.613 |
| 8/15/08 | 130.434 | 184.284 |
| 8/18/08 | 130.602 | 184.683 |
| 8/19/08 | 130.398 | 183.646 |
| 8/20/08 | 130.419 | 183.254 |
| 8/21/08 | 130.108 | 182.53 |
| 8/22/08 | 130.151 | 183.008 |
| 8/25/08 | 130.41 | 182.506 |
| 8/26/08 | 130.329 | 182.612 |
| 8/27/08 | 130.324 | 183.005 |
| 8/28/08 | 130.39 | 183.789 |
| 8/29/08 | 130.367 | 183.945 |
| 9/2/08 | 130.456 | 184.372 |
| 9/3/08 | 130.73 | 184.188 |
| 9/4/08 | 130.86 | 184.062 |
| 9/5/08 | 130.924 | 183.633 |
| 9/8/08 | 130.659 | 185.404 |
| 9/9/08 | 130.746 | 184.971 |
| 9/10/08 | 130.216 | 184.753 |
| 9/11/08 | 129.657 | 184.781 |
| 9/12/08 | 129.157 | 186.437 |
| 9/15/08 | 126.795 | 182.554 |
| 9/16/08 | 124.184 | 178.891 |
| 9/17/08 | 121.669 | 176.992 |
| 9/18/08 | 120.881 | 175.271 |
| 9/19/08 | 123.946 | 179.706 |
| 9/22/08 | 124.133 | 178.234 |
| 9/23/08 | 123.14 | 175.258 |
| 9/24/08 | 122.928 | 172.854 |
| 9/25/08 | 122.099 | 169.225 |
| 9/26/08 | 120.028 | 165.986 |
| 9/29/08 | 120.207 | 162.86 |
| 9/30/08 | 120.091 | 161.705 |
| 10/1/08 | 119.941 | 159.135 |
| 10/2/08 | 120.054 | 153.419 |
| 10/3/08 | 120.525 | 153.294 |
| 10/6/08 | 119.613 | 148.829 |
| 10/7/08 | 119.375 | 148.255 |
| 10/8/08 | 117.89 | 144.519 |
| 10/9/08 | 116.533 | 140.426 |
| 10/10/08 | 113.456 | 128.045 |
| 10/13/08 | 115.439 | 129.556 |
| 10/14/08 | 118.167 | 136.962 |
| 10/15/08 | 117.737 | 132.584 |
| 10/16/08 | 117.369 | 130.305 |
| 10/17/08 | 117.25 | 132.319 |
| 10/20/08 | 117.689 | 137.367 |
| 10/21/08 | 118.497 | 139.164 |
| 10/22/08 | 118.811 | 138.414 |
| 10/23/08 | 118.75 | 137.271 |
| 10/24/08 | 118.111 | 134.178 |
| 10/27/08 | 118.21 | 134.998 |
| 10/28/08 | 118.128 | 138.34 |
| 10/29/08 | 118.357 | 144.16 |
| 10/30/08 | 118.667 | 147.337 |
| 10/31/08 | 119.094 | 144.731 |
| 11/3/08 | 119.31 | 144.807 |
| 11/4/08 | 120.423 | 146.098 |
| 11/5/08 | 121.52 | 145.895 |
| 11/6/08 | 121.636 | 144.841 |
| 11/7/08 | 121.578 | 143.895 |
| 11/10/08 | 122.174 | 142.054 |
| 11/11/08 | 122.502 | 140.978 |
| 11/12/08 | 122.238 | 138.161 |
| 11/13/08 | 122.09 | 136.553 |
| 11/14/08 | 122.192 | 135.64 |
| 11/17/08 | 121.972 | 134.231 |
| 11/18/08 | 122.11 | 130.953 |
| 11/19/08 | 121.94 | 125.622 |
| 11/20/08 | 121.437 | 121.39 |
| 11/21/08 | 120.543 | 117.049 |
| 11/24/08 | 120.581 | 116.641 |
| 11/25/08 | 121.321 | 119.261 |
| 11/26/08 | 121.803 | 121.392 |
| 11/28/08 | 122.031 | 122.649 |
| 12/1/08 | 122.628 | 123.432 |
| 12/2/08 | 122.663 | 125.557 |
| 12/3/08 | 123.148 | 126.978 |
| 12/4/08 | 123.322 | 126.514 |
| 12/5/08 | 123.447 | 124.655 |
| 12/8/08 | 123.436 | 126.904 |
| 12/9/08 | 123.801 | 127.649 |
| 12/10/08 | 124.152 | 126.558 |
| 12/11/08 | 124.5 | 123.896 |
| 12/12/08 | 124.483 | 121.856 |
| 12/15/08 | 124.965 | 124.172 |
| 12/16/08 | 125.697 | 125.437 |
| 12/17/08 | 127.228 | 127.483 |
| 12/18/08 | 128.281 | 129.059 |
| 12/19/08 | 128.334 | 130.38 |
| 12/22/08 | 128.544 | 131.172 |
| 12/23/08 | 129.015 | 132.195 |
| 12/24/08 | 129.274 | 131.656 |
| 12/26/08 | 129.535 | 136.13 |
| 12/29/08 | 129.834 | 139.743 |
| 12/30/08 | 130.42 | 146.576 |
| 12/31/08 | 130.473 | 148.886 |
| 1/2/09 | 130.456 | 150.901 |
| 1/5/09 | 130.524 | 154.964 |
| 1/6/09 | 131.132 | 158.55 |
| 1/7/09 | 131.476 | 157.922 |
| 1/8/09 | 131.509 | 154.548 |
| 1/9/09 | 131.899 | 155.038 |
| 1/12/09 | 132.115 | 155.09 |
| 1/13/09 | 131.98 | 153.446 |
| 1/14/09 | 131.914 | 151.292 |
| 1/15/09 | 131.418 | 150.346 |
| 1/16/09 | 131.612 | 151.994 |
| 1/20/09 | 130.898 | 151.643 |
| 1/21/09 | 130.622 | 151.062 |
| 1/22/09 | 130.169 | 150.114 |
| 1/23/09 | 130.063 | 149.528 |
| 1/26/09 | 130.187 | 149.884 |
| 1/27/09 | 130.757 | 149.946 |
| 1/28/09 | 131.377 | 151.826 |
| 1/29/09 | 130.895 | 151.693 |
| 1/30/09 | 130.625 | 150.956 |
| 2/2/09 | 130.793 | 151.521 |
| 2/3/09 | 130.475 | 151.444 |
| 2/4/09 | 130.138 | 151.704 |
| 2/5/09 | 130.041 | 151.868 |
| 2/6/09 | 130.096 | 151.844 |
| 2/9/09 | 130.196 | 151.59 |
| 2/10/09 | 130.887 | 151.416 |
| 2/11/09 | 131.304 | 150.069 |
| 2/12/09 | 131.194 | 149.768 |
| 2/13/09 | 130.865 | 149.475 |
| 2/17/09 | 130.943 | 147.774 |
| 2/18/09 | 130.406 | 146.817 |
| 2/19/09 | 129.793 | 147.231 |
| 2/20/09 | 128.916 | 146.211 |
| 2/23/09 | 128.37 | 145.794 |
| 2/24/09 | 127.803 | 143.43 |
| 2/25/09 | 127.426 | 143.418 |
| 2/26/09 | 127.198 | 143.76 |
| 2/27/09 | 127.049 | 142.136 |
| 3/2/09 | 126.633 | 140.033 |
| 3/3/09 | 126.067 | 138.861 |
| 3/4/09 | 124.893 | 137.909 |
| 3/5/09 | 124.609 | 137.847 |
| 3/6/09 | 124.444 | 137.385 |
| 3/9/09 | 123.603 | 136.385 |
| 3/10/09 | 123.655 | 138.532 |
| 3/11/09 | 124.014 | 141.298 |
| 3/12/09 | 124.461 | 143.754 |
| 3/13/09 | 125.17 | 145.832 |
| 3/16/09 | 125.255 | 148.411 |
| 3/17/09 | 125.417 | 148.524 |
| 3/18/09 | 126.205 | 148.925 |
| 3/19/09 | 127.235 | 150.542 |
| 3/20/09 | 126.981 | 150.136 |
| 3/23/09 | 127.143 | 151.604 |
| 3/24/09 | 127.1 | 151.748 |
| 3/25/09 | 127.075 | 152.349 |
| 3/26/09 | 127.22 | 153.846 |
| 3/27/09 | 127.5 | 154.41 |
| 3/30/09 | 127.215 | 153.244 |
| 3/31/09 | 127.458 | 153.056 |
| 4/1/09 | 127.54 | 151.638 |
| 4/2/09 | 127.858 | 154.221 |
| 4/3/09 | 127.69 | 155.167 |
| 4/6/09 | 127.941 | 155.661 |
| 4/7/09 | 128.085 | 156.435 |
| 4/8/09 | 128.571 | 157.282 |
| 4/9/09 | 128.913 | 158.84 |
| 4/13/09 | 129.49 | 159.761 |
| 4/14/09 | 130.04 | 161.2 |
| 4/15/09 | 130.452 | 161.157 |
| 4/16/09 | 130.89 | 162.163 |
| 4/17/09 | 131.156 | 163.249 |
| 4/20/09 | 131.458 | 163.078 |
| 4/21/09 | 131.255 | 161.127 |
| 4/22/09 | 130.991 | 161.853 |
| 4/23/09 | 131.156 | 162.265 |
| 4/24/09 | 131.448 | 164.314 |
| 4/27/09 | 131.544 | 165.134 |
| 4/28/09 | 131.549 | 165.558 |
| 4/29/09 | 131.771 | 167.449 |
| 4/30/09 | 131.931 | 170.695 |
| 5/1/09 | 131.967 | 171.124 |
| 5/4/09 | 132.202 | 172.922 |
| 5/5/09 | 132.638 | 173.874 |
| 5/6/09 | 133.139 | 175.093 |
| 5/7/09 | 133.502 | 176.426 |
| 5/8/09 | 133.846 | 176.351 |
| 5/11/09 | 134.164 | 175.384 |
| 5/12/09 | 134.441 | 174.909 |
| 5/13/09 | 134.576 | 173.862 |
| 5/14/09 | 134.423 | 172.898 |
| 5/15/09 | 134.684 | 172.875 |
| 5/18/09 | 134.628 | 173.172 |
| 5/19/09 | 134.731 | 174.565 |
| 5/20/09 | 135.279 | 176.814 |
| 5/21/09 | 135.281 | 177.011 |
| 5/22/09 | 135.232 | 177.614 |
| 5/26/09 | 135.122 | 177.787 |
| 5/27/09 | 135.109 | 178.662 |
| 5/28/09 | 135.037 | 179.161 |
| 5/29/09 | 135.789 | 180.117 |
| 6/1/09 | 135.929 | 181.755 |
| 6/2/09 | 136.467 | 183.068 |
| 6/3/09 | 137.008 | 183.074 |
| 6/4/09 | 136.751 | 183.18 |
| 6/5/09 | 136.256 | 184.222 |
| 6/8/09 | 136.087 | 184.131 |
| 6/9/09 | 136.334 | 184.338 |
| 6/10/09 | 136.37 | 185.155 |
| 6/11/09 | 136.679 | 185.691 |
| 6/12/09 | 137.069 | 186.029 |
| 6/15/09 | 137.447 | 185.922 |
| 6/16/09 | 137.536 | 185.222 |
| 6/17/09 | 137.588 | 183.478 |
| 6/18/09 | 137.196 | 182.137 |
| 6/19/09 | 137.28 | 182.406 |
| 6/22/09 | 137.56 | 181.418 |
| 6/23/09 | 137.675 | 181.047 |
| 6/24/09 | 137.663 | 181.662 |
| 6/25/09 | 137.841 | 181.764 |
| 6/26/09 | 138.148 | 182.259 |
| 6/29/09 | 138.212 | 182.695 |
| 6/30/09 | 138.199 | 183.418 |
| 7/1/09 | 138.338 | 184.147 |
| 7/2/09 | 138.614 | 184.518 |
| 7/6/09 | 138.639 | 184.164 |
| 7/7/09 | 138.83 | 184.232 |
| 7/8/09 | 139.235 | 183.552 |
| 7/9/09 | 139.219 | 183.283 |
| 7/10/09 | 139.459 | 183.161 |
| 7/13/09 | 139.614 | 182.328 |
| 7/14/09 | 139.447 | 182.985 |
| 7/15/09 | 139.134 | 184.133 |
| 7/16/09 | 139.44 | 183.072 |
| 7/17/09 | 139.508 | 183.923 |
| 7/20/09 | 139.826 | 185.422 |
| 7/21/09 | 140.532 | 186.133 |
| 7/22/09 | 140.549 | 186.258 |
| 7/23/09 | 140.265 | 187.842 |
| 7/24/09 | 140.235 | 188.784 |
| 7/27/09 | 140.241 | 189.994 |
| 7/28/09 | 140.546 | 190.525 |
| 7/29/09 | 140.825 | 190.972 |
| 7/30/09 | 140.931 | 191.652 |
| 7/31/09 | 141.596 | 192.396 |
| 8/3/09 | 141.598 | 194.166 |
| 8/4/09 | 141.658 | 194.633 |
| 8/5/09 | 141.833 | 194.773 |
| 8/6/09 | 141.89 | 195.532 |
| 8/7/09 | 141.685 | 196.147 |
| 8/10/09 | 142 | 196.565 |
| 8/11/09 | 142.22 | 196.26 |
| 8/12/09 | 142.022 | 195.203 |
| 8/13/09 | 142.374 | 195.364 |
| 8/14/09 | 142.717 | 195.22 |
| 8/17/09 | 142.709 | 193.999 |
| 8/18/09 | 142.745 | 194.058 |
| 8/19/09 | 142.782 | 193.578 |
| 8/20/09 | 142.855 | 193.879 |
| 8/21/09 | 142.676 | 193.944 |
| 8/24/09 | 142.923 | 194.371 |
| 8/25/09 | 143.181 | 194.706 |
| 8/26/09 | 143.397 | 195.118 |
| 8/27/09 | 143.367 | 195.376 |
| 8/28/09 | 143.458 | 195.784 |
| 8/31/09 | 143.651 | 195.702 |
| 9/1/09 | 143.764 | 196.012 |
| 9/2/09 | 143.95 | 195.849 |
| 9/3/09 | 144.062 | 195.85 |
| 9/4/09 | 144.013 | 196.249 |
| 9/8/09 | 143.842 | 196.32 |
| 9/9/09 | 143.816 | 196.903 |
| 9/10/09 | 144.422 | 197.708 |
| 9/11/09 | 144.954 | 199.024 |
| 9/14/09 | 144.784 | 200.449 |
| 9/15/09 | 144.87 | 201.668 |
| 9/16/09 | 145.077 | 203.376 |
| 9/17/09 | 145.163 | 203.225 |
| 9/18/09 | 145.178 | 203.449 |
| 9/21/09 | 145.104 | 203.398 |
| 9/22/09 | 145.178 | 204.464 |
| 9/23/09 | 145.291 | 205.26 |
| 9/24/09 | 145.54 | 205.056 |
| 9/25/09 | 145.466 | 204.834 |
| 9/28/09 | 145.678 | 205.029 |
| 9/29/09 | 145.639 | 205.239 |
| 9/30/09 | 145.562 | 204.688 |
| 10/1/09 | 145.797 | 204.177 |
| 10/2/09 | 145.834 | 203.433 |
| 10/5/09 | 145.996 | 204.013 |
| 10/6/09 | 146.011 | 204.636 |
| 10/7/09 | 146.196 | 204.343 |
| 10/8/09 | 146.221 | 204.647 |
| 10/9/09 | 145.532 | 204.609 |
| 10/12/09 | 145.532 | 204.674 |
| 10/13/09 | 145.867 | 204.684 |
| 10/14/09 | 145.709 | 205.33 |
| 10/15/09 | 145.52 | 205.501 |
| 10/16/09 | 145.607 | 205.842 |
| 10/19/09 | 145.776 | 206.212 |
| 10/20/09 | 146.295 | 206.698 |
| 10/21/09 | 146.128 | 206.858 |
| 10/22/09 | 146.196 | 206.873 |
| 10/23/09 | 146.066 | 206.892 |
| 10/26/09 | 145.902 | 207.187 |
| 10/27/09 | 146.185 | 207.004 |
| 10/28/09 | 146.469 | 206.288 |
| 10/29/09 | 146.193 | 206.142 |
| 10/30/09 | 146.59 | 206.237 |
| 11/2/09 | 146.64 | 207.057 |
| 11/3/09 | 146.39 | 206.57 |
| 11/4/09 | 146.221 | 206.902 |
| 11/5/09 | 146.236 | 207.278 |
| 11/6/09 | 146.445 | 207.203 |
| 11/9/09 | 146.634 | 207.531 |
| 11/10/09 | 146.805 | 207.885 |
| 11/11/09 | 146.589 | 208.128 |
| 11/12/09 | 146.802 | 208.108 |
| 11/13/09 | 146.932 | 208.309 |
| 11/16/09 | 147.389 | 209.277 |
| 11/17/09 | 147.605 | 209.729 |
| 11/18/09 | 147.63 | 210.137 |
| 11/19/09 | 147.722 | 210.127 |
| 11/20/09 | 147.644 | 210.131 |
| 11/23/09 | 147.571 | 210.276 |
| 11/24/09 | 147.8 | 210.41 |
| 11/25/09 | 147.828 | 210.711 |
| 11/27/09 | 147.758 | 210.509 |
| 11/30/09 | 148.234 | 210.268 |
| 12/1/09 | 148.215 | 210.7 |
| 12/2/09 | 148.218 | 211.242 |
| 12/3/09 | 148.048 | 211.956 |
| 12/4/09 | 147.63 | 212.174 |
| 12/7/09 | 148.001 | 212.95 |
| 12/8/09 | 148.314 | 213.098 |
| 12/9/09 | 148.379 | 213.287 |
| 12/10/09 | 148.268 | 213.83 |
| 12/11/09 | 148.096 | 214.144 |
| 12/14/09 | 148.369 | 214.803 |
| 12/15/09 | 148.247 | 215.353 |
| 12/16/09 | 148.348 | 215.754 |
| 12/17/09 | 148.73 | 215.943 |
| 12/18/09 | 148.822 | 215.797 |
| 12/21/09 | 148.384 | 216.16 |
| 12/22/09 | 148.029 | 216.437 |
| 12/23/09 | 148.052 | 216.453 |
| 12/24/09 | 147.9 | 216.689 |
| 12/28/09 | 147.631 | 216.669 |
| 12/29/09 | 147.668 | 216.976 |
| 12/30/09 | 147.94 | 217.137 |
| 12/31/09 | 147.73 | 217.398 |
| 1/4/10 | 148.138 | 218.276 |
| 1/5/10 | 148.728 | 219.533 |
| 1/6/10 | 148.687 | 220.973 |
| 1/7/10 | 148.791 | 221.667 |
| 1/8/10 | 148.871 | 221.768 |
| 1/11/10 | 148.965 | 222.058 |
| 1/12/10 | 149.302 | 220.936 |
| 1/13/10 | 149.169 | 221.002 |
| 1/14/10 | 149.16 | 220.851 |
| 1/15/10 | 149.443 | 220.69 |
| 1/19/10 | 149.142 | 220.408 |
| 1/20/10 | 149.341 | 220.144 |
| 1/21/10 | 149.537 | 219.594 |
| 1/22/10 | 149.358 | 218.364 |
| 1/25/10 | 149.258 | 217.768 |
| 1/26/10 | 149.302 | 217.635 |
| 1/27/10 | 149.185 | 218.028 |
| 1/28/10 | 149.057 | 217.984 |
| 1/29/10 | 149.097 | 217.958 |
| 2/1/10 | 149.11 | 218.038 |
| 2/2/10 | 149.242 | 218.46 |
| 2/3/10 | 149.11 | 218.924 |
| 2/4/10 | 149.181 | 218.611 |
| 2/5/10 | 149.188 | 217.3 |
| 2/8/10 | 149.118 | 216.652 |
| 2/9/10 | 148.96 | 216.199 |
| 2/10/10 | 148.733 | 215.145 |
| 2/11/10 | 148.306 | 214.966 |
| 2/12/10 | 148.631 | 215.187 |
| 2/16/10 | 148.612 | 215.148 |
| 2/17/10 | 148.607 | 216.754 |
| 2/18/10 | 148.543 | 217.542 |
| 2/19/10 | 148.518 | 218.407 |
| 2/22/10 | 148.735 | 219.255 |
| 2/23/10 | 149.048 | 218.904 |
| 2/24/10 | 149.199 | 219.077 |
| 2/25/10 | 149.317 | 219.009 |
| 2/26/10 | 149.72 | 219.579 |
| 3/1/10 | 149.806 | 220.874 |
| 3/2/10 | 149.879 | 221.253 |
| 3/3/10 | 149.999 | 221.505 |
| 3/4/10 | 150.058 | 221.754 |
| 3/5/10 | 149.837 | 222.349 |
| 3/8/10 | 149.871 | 223.336 |
| 3/9/10 | 149.986 | 223.623 |
| 3/10/10 | 149.839 | 224.107 |
| 3/11/10 | 149.843 | 224.21 |
| 3/12/10 | 150.118 | 224.465 |
| 3/15/10 | 150.237 | 224.508 |
| 3/16/10 | 150.455 | 224.314 |
| 3/17/10 | 150.685 | 225.249 |
| 3/18/10 | 150.697 | 225.602 |
| 3/19/10 | 150.695 | 225.533 |
| 3/22/10 | 150.701 | 225.49 |
| 3/23/10 | 150.774 | 225.713 |
| 3/24/10 | 150.157 | 226.224 |
| 3/25/10 | 149.904 | 226.327 |
| 3/26/10 | 149.978 | 226.844 |
| 3/29/10 | 150.108 | 226.98 |
| 3/30/10 | 150.193 | 227.317 |
| 3/31/10 | 150.422 | 227.06 |
| 4/1/10 | 150.302 | 226.854 |
| 4/5/10 | 149.89 | 227.336 |
| 4/6/10 | 149.886 | 227.114 |
| 4/7/10 | 150.166 | 227.482 |
| 4/8/10 | 150.222 | 227.201 |
| 4/9/10 | 150.367 | 227.559 |
| 4/12/10 | 150.743 | 228.013 |
| 4/13/10 | 150.977 | 228.362 |
| 4/14/10 | 151.082 | 228.862 |
| 4/15/10 | 151.197 | 229.417 |
| 4/16/10 | 151.43 | 229.746 |
| 4/19/10 | 151.29 | 229.378 |
| 4/20/10 | 151.303 | 229.613 |
| 4/21/10 | 151.516 | 229.922 |
| 4/22/10 | 151.505 | 229.786 |
| 4/23/10 | 151.187 | 230.343 |
| 4/26/10 | 151.183 | 231.026 |
| 4/27/10 | 151.518 | 230.985 |
| 4/28/10 | 151.375 | 230.656 |
| 4/29/10 | 151.484 | 231.163 |
| 4/30/10 | 151.823 | 231.044 |
| 5/3/10 | 151.714 | 231.082 |
| 5/4/10 | 151.911 | 230.704 |
| 5/5/10 | 151.871 | 229.082 |
| 5/6/10 | 151.518 | 226.956 |
| 5/7/10 | 150.982 | 224.839 |
| 5/10/10 | 151.305 | 226.831 |
| 5/11/10 | 151.261 | 226.496 |
| 5/12/10 | 151.206 | 227.638 |
| 5/13/10 | 151.488 | 228.391 |
| 5/14/10 | 151.808 | 227.589 |
| 5/17/10 | 151.785 | 227.491 |
| 5/18/10 | 151.962 | 227.398 |
| 5/19/10 | 151.883 | 226.231 |
| 5/20/10 | 151.828 | 224.056 |
| 5/21/10 | 151.576 | 223.475 |
| 5/24/10 | 151.744 | 224.018 |
| 5/25/10 | 151.254 | 222.441 |
| 5/26/10 | 151.228 | 223.388 |
| 5/27/10 | 150.909 | 224.158 |
| 5/28/10 | 151.267 | 224.872 |
| 6/1/10 | 151.166 | 224.359 |
| 6/2/10 | 151.005 | 224.369 |
| 6/3/10 | 151.087 | 224.964 |
| 6/4/10 | 151.536 | 224.598 |
| 6/7/10 | 151.568 | 224.254 |
| 6/8/10 | 151.449 | 223.379 |
| 6/9/10 | 151.431 | 223.411 |
| 6/10/10 | 151.033 | 223.391 |
| 6/11/10 | 151.068 | 222.938 |
| 6/14/10 | 151.168 | 223.8 |
| 6/15/10 | 151.237 | 224.435 |
| 6/16/10 | 151.35 | 225.145 |
| 6/17/10 | 151.85 | 226.255 |
| 6/18/10 | 151.95 | 226.827 |
| 6/21/10 | 152.099 | 228.18 |
| 6/22/10 | 152.336 | 227.899 |
| 6/23/10 | 152.544 | 227.893 |
| 6/24/10 | 152.505 | 227.317 |
| 6/25/10 | 152.512 | 227.529 |
| 6/28/10 | 152.919 | 227.662 |
| 6/29/10 | 153.088 | 226.881 |
| 6/30/10 | 153.256 | 227.281 |
| 7/1/10 | 153.26 | 226.657 |
| 7/2/10 | 153.296 | 226.726 |
| 7/6/10 | 153.401 | 226.935 |
| 7/7/10 | 153.275 | 227.239 |
| 7/8/10 | 153.332 | 227.914 |
| 7/9/10 | 153.346 | 228.3 |
| 7/12/10 | 153.406 | 228.5 |
| 7/13/10 | 153.508 | 229.676 |
| 7/14/10 | 153.54 | 229.747 |
| 7/15/10 | 154.186 | 230.02 |
| 7/16/10 | 154.45 | 230.311 |
| 7/19/10 | 154.421 | 230.396 |
| 7/20/10 | 154.571 | 230.597 |
| 7/21/10 | 154.713 | 230.948 |
| 7/22/10 | 154.81 | 231.615 |
| 7/23/10 | 154.787 | 232.159 |
| 7/26/10 | 154.819 | 232.551 |
| 7/27/10 | 154.919 | 233.167 |
| 7/28/10 | 154.953 | 233.424 |
| 7/29/10 | 155.219 | 233.158 |
| 7/30/10 | 155.681 | 233.528 |
| 8/2/10 | 155.664 | 233.845 |
| 8/3/10 | 155.934 | 234.218 |
| 8/4/10 | 155.819 | 234.224 |
| 8/5/10 | 155.907 | 234.331 |
| 8/6/10 | 156.202 | 234.611 |
| 8/9/10 | 156.185 | 234.826 |
| 8/10/10 | 156.305 | 234.462 |
| 8/11/10 | 156.415 | 234.013 |
| 8/12/10 | 156.375 | 233.324 |
| 8/13/10 | 156.5 | 233.036 |
| 8/16/10 | 157.283 | 233.307 |
| 8/17/10 | 157.199 | 233.51 |
| 8/18/10 | 157.299 | 233.735 |
| 8/19/10 | 157.491 | 233.606 |
| 8/20/10 | 157.371 | 233.25 |
| 8/23/10 | 157.306 | 233.433 |
| 8/24/10 | 157.642 | 233.185 |
| 8/25/10 | 157.604 | 233.111 |
| 8/26/10 | 157.53 | 232.964 |
| 8/27/10 | 157.001 | 233.13 |
| 8/30/10 | 157.269 | 233.482 |
| 8/31/10 | 157.502 | 233.106 |
| 9/1/10 | 157.137 | 233.487 |
| 9/2/10 | 156.997 | 233.998 |
| 9/3/10 | 156.836 | 234.431 |
| 9/7/10 | 157.25 | 234.672 |
| 9/8/10 | 157.273 | 234.77 |
| 9/9/10 | 156.872 | 235.138 |
| 9/10/10 | 156.635 | 235.369 |
| 9/13/10 | 157.002 | 236.122 |
| 9/14/10 | 157.428 | 236.022 |
| 9/15/10 | 157.367 | 236.341 |
| 9/16/10 | 157.163 | 237.106 |
| 9/17/10 | 157.231 | 237.261 |
| 9/20/10 | 157.459 | 237.686 |
| 9/21/10 | 157.688 | 238.039 |
| 9/22/10 | 158.121 | 238.12 |
| 9/23/10 | 158.207 | 237.83 |
| 9/24/10 | 157.946 | 237.943 |
| 9/27/10 | 158.387 | 238.553 |
| 9/28/10 | 158.5 | 238.76 |
| 9/29/10 | 158.556 | 239.176 |
| 9/30/10 | 158.574 | 239.596 |
| 10/1/10 | 158.719 | 239.917 |
| 10/4/10 | 158.723 | 240.343 |
| 10/5/10 | 158.915 | 240.842 |
| 10/6/10 | 159.572 | 241.409 |
| 10/7/10 | 159.662 | 241.712 |
| 10/8/10 | 159.778 | 242.02 |
| 10/11/10 | 159.647 | 242.1 |
| 10/12/10 | 159.547 | 242.33 |
| 10/13/10 | 159.368 | 243.238 |
| 10/14/10 | 158.936 | 243.015 |
| 10/15/10 | 158.56 | 242.955 |
| 10/18/10 | 158.841 | 242.956 |
| 10/19/10 | 159.018 | 242.909 |
| 10/20/10 | 159.081 | 242.726 |
| 10/21/10 | 159 | 243.221 |
| 10/22/10 | 158.985 | 243.231 |
| 10/25/10 | 159.316 | 243.831 |
| 10/26/10 | 158.883 | 244.418 |
| 10/27/10 | 158.57 | 244.341 |
| 10/28/10 | 158.749 | 244.582 |
| 10/29/10 | 159.062 | 244.452 |
| 11/1/10 | 159.158 | 244.733 |
| 11/2/10 | 159.471 | 244.362 |
| 11/3/10 | 159.656 | 244.821 |
| 11/4/10 | 159.896 | 245.495 |
| 11/5/10 | 159.653 | 245.54 |
| 11/8/10 | 159.578 | 245.717 |
| 11/9/10 | 159.213 | 245.828 |
| 11/10/10 | 158.489 | 244.84 |
| 11/11/10 | 158.591 | 244.793 |
| 11/12/10 | 158.389 | 244.031 |
| 11/15/10 | 157.814 | 243.894 |
| 11/16/10 | 157.664 | 242.835 |
| 11/17/10 | 157.963 | 242.423 |
| 11/18/10 | 157.658 | 242.693 |
| 11/19/10 | 157.922 | 241.761 |
| 11/22/10 | 158.162 | 241.668 |
| 11/23/10 | 158.357 | 240.889 |
| 11/24/10 | 157.748 | 240.806 |
| 11/26/10 | 157.77 | 241.172 |
| 11/29/10 | 157.93 | 240.436 |
| 11/30/10 | 158.106 | 240.163 |
| 12/1/10 | 157.436 | 240.816 |
| 12/2/10 | 157.319 | 241.508 |
| 12/3/10 | 157.409 | 241.776 |
| 12/6/10 | 157.748 | 242.064 |
| 12/7/10 | 157.248 | 242.309 |
| 12/8/10 | 156.543 | 241.78 |
| 12/9/10 | 156.743 | 241.89 |
| 12/10/10 | 156.679 | 241.503 |
| 12/13/10 | 156.633 | 241.636 |
| 12/14/10 | 156.258 | 241.537 |
| 12/15/10 | 155.875 | 241.161 |
| 12/16/10 | 155.864 | 241.32 |
| 12/17/10 | 156.338 | 241.362 |
| 12/20/10 | 156.934 | 241.546 |
| 12/21/10 | 156.801 | 242.022 |
| 12/22/10 | 156.866 | 242.026 |
| 12/23/10 | 156.734 | 242.402 |
| 12/27/10 | 156.592 | 242.345 |
| 12/28/10 | 156.46 | 242.906 |
| 12/29/10 | 156.734 | 243.104 |
| 12/30/10 | 157 | 243.491 |
| 12/31/10 | 157.322 | 243.889 |